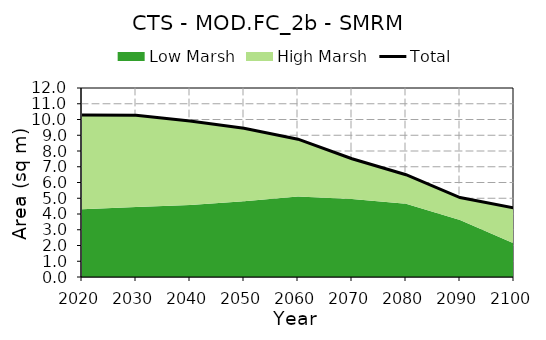
| Category | Total |
|---|---|
| 0 | 10.286 |
| 1 | 10.274 |
| 2 | 9.904 |
| 3 | 9.444 |
| 4 | 8.75 |
| 5 | 7.511 |
| 6 | 6.494 |
| 7 | 5.043 |
| 8 | 4.389 |